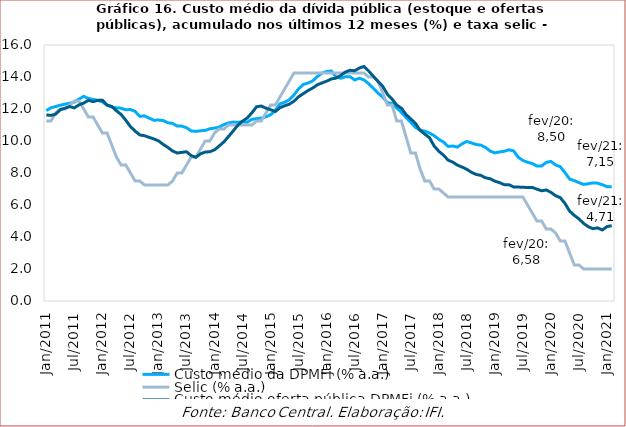
| Category | Custo médio da DPMFi (% a.a.) | Selic (% a.a.) | Custo médio oferta pública DPMFi (% a.a.) |
|---|---|---|---|
| 2011-01-31 | 11.9 | 11.25 | 11.63 |
| 2011-02-28 | 12.08 | 11.25 | 11.6 |
| 2011-03-31 | 12.155 | 11.75 | 11.68 |
| 2011-04-30 | 12.24 | 12 | 11.96 |
| 2011-05-31 | 12.3 | 12 | 12.05 |
| 2011-06-30 | 12.36 | 12.25 | 12.15 |
| 2011-07-31 | 12.43 | 12.5 | 12.07 |
| 2011-08-31 | 12.62 | 12.5 | 12.26 |
| 2011-09-30 | 12.79 | 12 | 12.37 |
| 2011-10-31 | 12.66 | 11.5 | 12.54 |
| 2011-11-30 | 12.6 | 11.5 | 12.46 |
| 2011-12-31 | 12.54 | 11 | 12.54 |
| 2012-01-31 | 12.44 | 10.5 | 12.55 |
| 2012-02-29 | 12.23 | 10.5 | 12.25 |
| 2012-03-31 | 12.12 | 9.75 | 12.16 |
| 2012-04-30 | 12.07 | 9 | 11.89 |
| 2012-05-31 | 12.05 | 8.5 | 11.66 |
| 2012-06-30 | 11.95 | 8.5 | 11.3 |
| 2012-07-31 | 11.97 | 8 | 10.9 |
| 2012-08-31 | 11.85 | 7.5 | 10.62 |
| 2012-09-30 | 11.54 | 7.5 | 10.38 |
| 2012-10-31 | 11.57 | 7.25 | 10.33 |
| 2012-11-30 | 11.43 | 7.25 | 10.23 |
| 2012-12-31 | 11.3 | 7.25 | 10.13 |
| 2013-01-31 | 11.31 | 7.25 | 10.01 |
| 2013-02-28 | 11.28 | 7.25 | 9.79 |
| 2013-03-31 | 11.14 | 7.25 | 9.6 |
| 2013-04-30 | 11.1 | 7.5 | 9.38 |
| 2013-05-31 | 10.93 | 8 | 9.25 |
| 2013-06-30 | 10.93 | 8 | 9.29 |
| 2013-07-31 | 10.83 | 8.5 | 9.33 |
| 2013-08-31 | 10.63 | 9 | 9.09 |
| 2013-09-30 | 10.6 | 9 | 8.98 |
| 2013-10-31 | 10.637 | 9.5 | 9.2 |
| 2013-11-30 | 10.663 | 10 | 9.31 |
| 2013-12-31 | 10.763 | 10 | 9.33 |
| 2014-01-31 | 10.805 | 10.5 | 9.449 |
| 2014-02-28 | 10.867 | 10.75 | 9.686 |
| 2014-03-31 | 11.027 | 10.75 | 9.946 |
| 2014-04-30 | 11.131 | 11 | 10.282 |
| 2014-05-31 | 11.182 | 11 | 10.629 |
| 2014-06-30 | 11.173 | 11 | 10.991 |
| 2014-07-31 | 11.197 | 11 | 11.246 |
| 2014-08-31 | 11.175 | 11 | 11.439 |
| 2014-09-30 | 11.356 | 11 | 11.764 |
| 2014-10-31 | 11.391 | 11.25 | 12.14 |
| 2014-11-30 | 11.435 | 11.25 | 12.187 |
| 2014-12-31 | 11.512 | 11.75 | 12.053 |
| 2015-01-31 | 11.643 | 12.25 | 11.956 |
| 2015-02-27 | 11.909 | 12.25 | 11.84 |
| 2015-03-31 | 12.323 | 12.75 | 12.08 |
| 2015-04-30 | 12.419 | 13.25 | 12.204 |
| 2015-05-31 | 12.579 | 13.75 | 12.297 |
| 2015-06-30 | 12.877 | 14.25 | 12.491 |
| 2015-07-31 | 13.263 | 14.25 | 12.765 |
| 2015-08-31 | 13.532 | 14.25 | 12.96 |
| 2015-09-30 | 13.618 | 14.25 | 13.15 |
| 2015-10-31 | 13.754 | 14.25 | 13.31 |
| 2015-11-30 | 14.029 | 14.25 | 13.51 |
| 2015-12-31 | 14.241 | 14.25 | 13.63 |
| 2016-01-31 | 14.346 | 14.25 | 13.74 |
| 2016-02-29 | 14.372 | 14.25 | 13.88 |
| 2016-03-31 | 14.015 | 14.25 | 13.93 |
| 2016-04-30 | 13.92 | 14.25 | 14.09 |
| 2016-05-31 | 14.016 | 14.25 | 14.31 |
| 2016-06-30 | 14.017 | 14.25 | 14.42 |
| 2016-07-31 | 13.814 | 14.25 | 14.39 |
| 2016-08-31 | 13.924 | 14.25 | 14.56 |
| 2016-09-30 | 13.82 | 14.25 | 14.66 |
| 2016-10-31 | 13.578 | 14 | 14.37 |
| 2016-11-30 | 13.296 | 14 | 14.04 |
| 2016-12-31 | 12.996 | 13.75 | 13.72 |
| 2017-01-31 | 12.739 | 13 | 13.42 |
| 2017-02-28 | 12.394 | 12.25 | 12.92 |
| 2017-03-31 | 12.351 | 12.25 | 12.62 |
| 2017-04-30 | 12.068 | 11.25 | 12.24 |
| 2017-05-31 | 11.784 | 11.25 | 12.05 |
| 2017-06-30 | 11.466 | 10.25 | 11.65 |
| 2017-07-31 | 11.168 | 9.25 | 11.38 |
| 2017-08-31 | 10.85 | 9.25 | 11.1 |
| 2017-09-30 | 10.68 | 8.25 | 10.67 |
| 2017-10-31 | 10.617 | 7.5 | 10.43 |
| 2017-11-30 | 10.498 | 7.5 | 10.21 |
| 2017-12-31 | 10.339 | 7 | 9.69 |
| 2018-01-31 | 10.104 | 7 | 9.36 |
| 2018-02-28 | 9.934 | 6.75 | 9.12 |
| 2018-03-31 | 9.659 | 6.5 | 8.8 |
| 2018-04-30 | 9.686 | 6.5 | 8.68 |
| 2018-05-31 | 9.617 | 6.5 | 8.49 |
| 2018-06-30 | 9.83 | 6.5 | 8.37 |
| 2018-07-31 | 9.971 | 6.5 | 8.23 |
| 2018-08-31 | 9.878 | 6.5 | 8.04 |
| 2018-09-30 | 9.78 | 6.5 | 7.91 |
| 2018-10-31 | 9.743 | 6.5 | 7.85 |
| 2018-11-30 | 9.6 | 6.5 | 7.7 |
| 2018-12-31 | 9.371 | 6.5 | 7.64 |
| 2019-01-31 | 9.254 | 6.5 | 7.49 |
| 2019-02-28 | 9.318 | 6.5 | 7.4 |
| 2019-03-31 | 9.355 | 6.5 | 7.27 |
| 2019-04-30 | 9.449 | 6.5 | 7.27 |
| 2019-05-31 | 9.385 | 6.5 | 7.13 |
| 2019-06-30 | 8.987 | 6.5 | 7.12 |
| 2019-07-31 | 8.788 | 6.5 | 7.11 |
| 2019-08-31 | 8.669 | 6 | 7.09 |
| 2019-09-30 | 8.594 | 5.5 | 7.1 |
| 2019-10-31 | 8.431 | 5 | 6.99 |
| 2019-11-30 | 8.435 | 5 | 6.89 |
| 2019-12-31 | 8.665 | 4.5 | 6.94 |
| 2020-01-31 | 8.723 | 4.5 | 6.79 |
| 2020-02-29 | 8.505 | 4.25 | 6.58 |
| 2020-03-31 | 8.392 | 3.75 | 6.46 |
| 2020-04-30 | 8.031 | 3.75 | 6.1 |
| 2020-05-31 | 7.621 | 3 | 5.62 |
| 2020-06-30 | 7.524 | 2.25 | 5.35 |
| 2020-07-31 | 7.398 | 2.25 | 5.13 |
| 2020-08-31 | 7.286 | 2 | 4.85 |
| 2020-09-30 | 7.331 | 2 | 4.64 |
| 2020-10-31 | 7.381 | 2 | 4.52 |
| 2020-11-30 | 7.365 | 2 | 4.57 |
| 2020-12-31 | 7.269 | 2 | 4.44 |
| 2021-01-31 | 7.146 | 2 | 4.649 |
| 2021-02-28 | 7.146 | 2 | 4.71 |